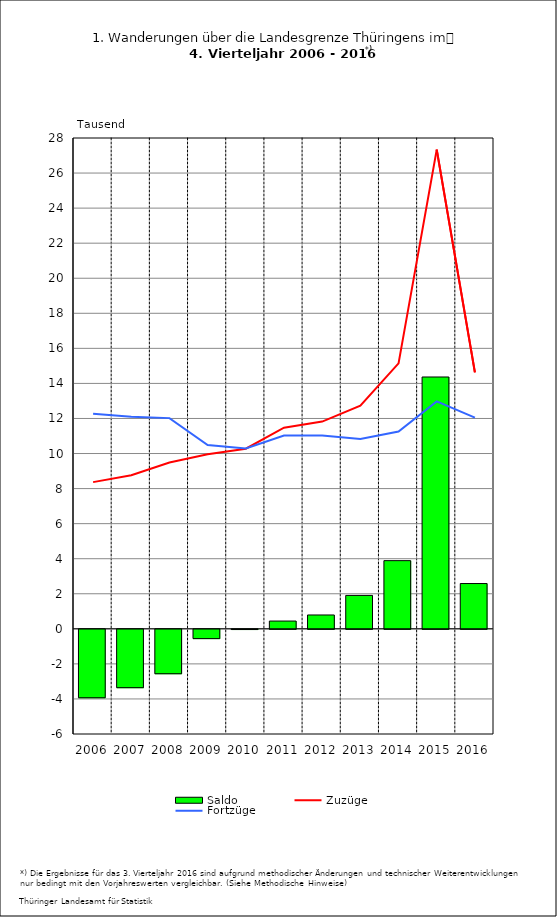
| Category | Saldo |
|---|---|
| 2006.0 | -3.904 |
| 2007.0 | -3.329 |
| 2008.0 | -2.534 |
| 2009.0 | -0.53 |
| 2010.0 | -0.012 |
| 2011.0 | 0.443 |
| 2012.0 | 0.79 |
| 2013.0 | 1.906 |
| 2014.0 | 3.889 |
| 2015.0 | 14.366 |
| 2016.0 | 2.583 |